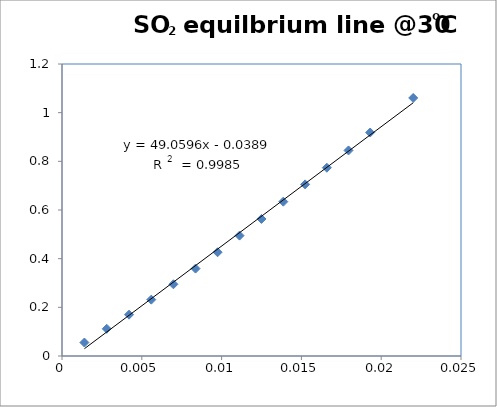
| Category | x molar fraction in liquid |
|---|---|
| 0.0014042752379466376 | 0.055 |
| 0.0028046120286693674 | 0.112 |
| 0.004201026917690991 | 0.17 |
| 0.005593536357986327 | 0.232 |
| 0.0069821567106283944 | 0.295 |
| 0.008366904245429192 | 0.359 |
| 0.00974779514157512 | 0.426 |
| 0.011124845488257108 | 0.495 |
| 0.01249807128529548 | 0.563 |
| 0.01386748844375963 | 0.634 |
| 0.015233112786582551 | 0.705 |
| 0.016594960049170254 | 0.774 |
| 0.017953045880006138 | 0.845 |
| 0.019307385841250385 | 0.918 |
| 0.022004889975550123 | 1.061 |